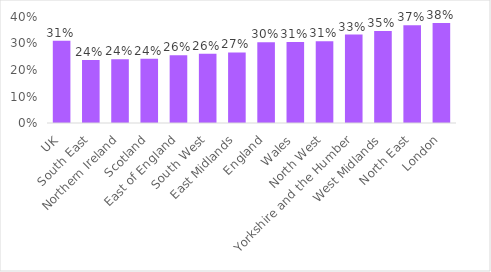
| Category | Series 0 |
|---|---|
| UK | 0.31 |
|   South East | 0.238 |
| Northern Ireland | 0.24 |
| Scotland | 0.243 |
|   East of England | 0.255 |
|   South West | 0.261 |
|   East Midlands | 0.266 |
| England | 0.304 |
| Wales | 0.306 |
|   North West | 0.308 |
|   Yorkshire and the Humber | 0.334 |
|   West Midlands | 0.347 |
|   North East | 0.369 |
|   London | 0.378 |